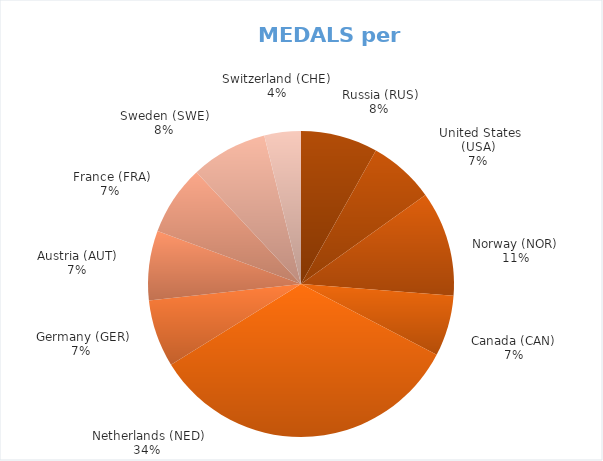
| Category | Per Participant |
|---|---|
|  Russia (RUS) | 0.142 |
|  United States (USA) | 0.122 |
| Norway (NOR) | 0.194 |
| Canada (CAN) | 0.113 |
|  Netherlands (NED) | 0.585 |
|  Germany (GER) | 0.124 |
| Austria (AUT) | 0.129 |
|  France (FRA) | 0.129 |
| Sweden (SWE) | 0.142 |
| Switzerland (CHE) | 0.067 |